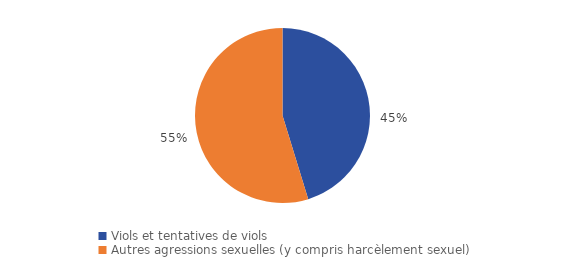
| Category | Series 0 |
|---|---|
| Viols et tentatives de viols | 34300 |
| Autres agressions sexuelles (y compris harcèlement sexuel) | 41500 |